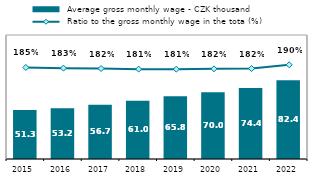
| Category |  Average gross monthly wage - CZK thousand |
|---|---|
| 2015.0 | 51.319 |
| 2016.0 | 53.241 |
| 2017.0 | 56.747 |
| 2018.0 | 61.026 |
| 2019.0 | 65.787 |
| 2020.0 | 70.018 |
| 2021.0 | 74.357 |
| 2022.0 | 82.441 |